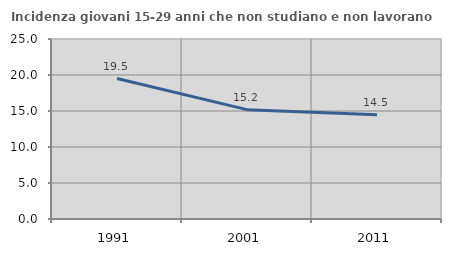
| Category | Incidenza giovani 15-29 anni che non studiano e non lavorano  |
|---|---|
| 1991.0 | 19.512 |
| 2001.0 | 15.19 |
| 2011.0 | 14.493 |